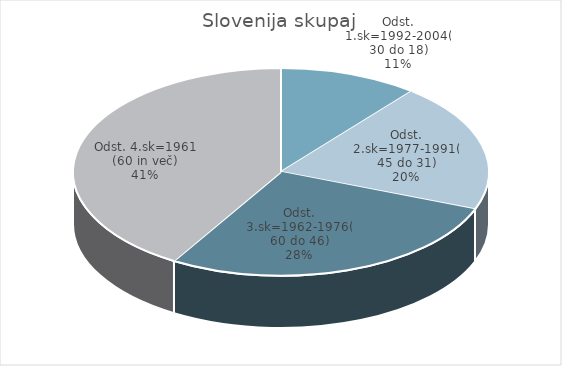
| Category | Slovenija skupaj |
|---|---|
| Odst. 1.sk=1992-2004(30 do 18) | 5.74 |
| Odst. 2.sk=1977-1991(45 do 31) | 10.63 |
| Odst. 3.sk=1962-1976(60 do 46) | 14.7 |
| Odst. 4.sk=1961 (60 in več) | 21.95 |